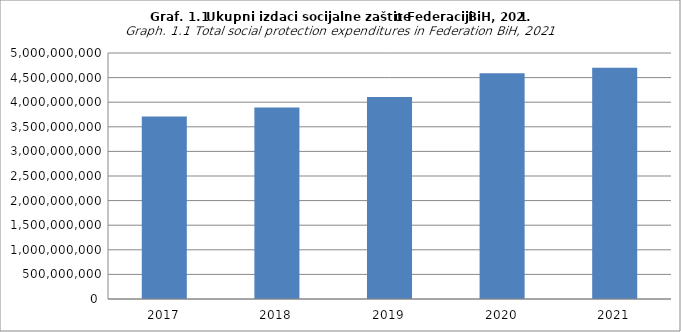
| Category | Ukupni izdaci socijalne zaštite  |
|---|---|
| 2017 | 3710279013.49 |
| 2018 | 3893455488.46 |
| 2019 | 4104612965.83 |
| 2020 | 4590725820.97 |
| 2021 | 4701111187.26 |